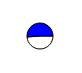
| Category | Series 0 |
|---|---|
| 0 | 22013 |
| 1 | 23091 |